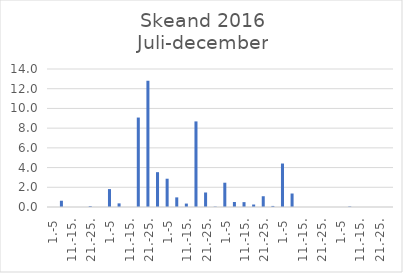
| Category | Series 0 |
|---|---|
| 1.-5 | 0 |
| 6.-10. | 0.636 |
| 11.-15. | 0 |
| 16.-20. | 0 |
| 21.-25. | 0.088 |
| 26.-31. | 0 |
| 1.-5 | 1.818 |
| 6.-10. | 0.368 |
| 11.-15. | 0 |
| 16.-20. | 9.074 |
| 21.-25. | 12.808 |
| 26.-31. | 3.534 |
| 1.-5 | 2.869 |
| 6.-10. | 0.976 |
| 11.-15. | 0.348 |
| 16.-20. | 8.683 |
| 21.-25. | 1.471 |
| 26.-30. | 0.043 |
| 1.-5 | 2.464 |
| 6.-10. | 0.506 |
| 11.-15. | 0.494 |
| 16.-20. | 0.252 |
| 21.-25. | 1.092 |
| 26.-31. | 0.108 |
| 1.-5 | 4.411 |
| 6.-10. | 1.368 |
| 11.-15. | 0 |
| 16.-20. | 0 |
| 21.-25. | 0 |
| 26.-30. | 0 |
| 1.-5 | 0 |
| 6.-10. | 0.056 |
| 11.-15. | 0 |
| 16.-20. | 0 |
| 21.-25. | 0 |
| 26.-31. | 0 |